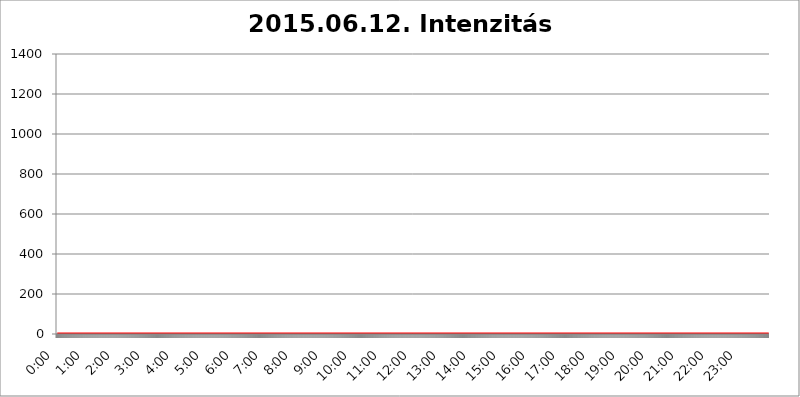
| Category | 2015.06.12. Intenzitás [W/m^2] |
|---|---|
| 0.0 | 0 |
| 0.0006944444444444445 | 0 |
| 0.001388888888888889 | 0 |
| 0.0020833333333333333 | 0 |
| 0.002777777777777778 | 0 |
| 0.003472222222222222 | 0 |
| 0.004166666666666667 | 0 |
| 0.004861111111111111 | 0 |
| 0.005555555555555556 | 0 |
| 0.0062499999999999995 | 0 |
| 0.006944444444444444 | 0 |
| 0.007638888888888889 | 0 |
| 0.008333333333333333 | 0 |
| 0.009027777777777779 | 0 |
| 0.009722222222222222 | 0 |
| 0.010416666666666666 | 0 |
| 0.011111111111111112 | 0 |
| 0.011805555555555555 | 0 |
| 0.012499999999999999 | 0 |
| 0.013194444444444444 | 0 |
| 0.013888888888888888 | 0 |
| 0.014583333333333332 | 0 |
| 0.015277777777777777 | 0 |
| 0.015972222222222224 | 0 |
| 0.016666666666666666 | 0 |
| 0.017361111111111112 | 0 |
| 0.018055555555555557 | 0 |
| 0.01875 | 0 |
| 0.019444444444444445 | 0 |
| 0.02013888888888889 | 0 |
| 0.020833333333333332 | 0 |
| 0.02152777777777778 | 0 |
| 0.022222222222222223 | 0 |
| 0.02291666666666667 | 0 |
| 0.02361111111111111 | 0 |
| 0.024305555555555556 | 0 |
| 0.024999999999999998 | 0 |
| 0.025694444444444447 | 0 |
| 0.02638888888888889 | 0 |
| 0.027083333333333334 | 0 |
| 0.027777777777777776 | 0 |
| 0.02847222222222222 | 0 |
| 0.029166666666666664 | 0 |
| 0.029861111111111113 | 0 |
| 0.030555555555555555 | 0 |
| 0.03125 | 0 |
| 0.03194444444444445 | 0 |
| 0.03263888888888889 | 0 |
| 0.03333333333333333 | 0 |
| 0.034027777777777775 | 0 |
| 0.034722222222222224 | 0 |
| 0.035416666666666666 | 0 |
| 0.036111111111111115 | 0 |
| 0.03680555555555556 | 0 |
| 0.0375 | 0 |
| 0.03819444444444444 | 0 |
| 0.03888888888888889 | 0 |
| 0.03958333333333333 | 0 |
| 0.04027777777777778 | 0 |
| 0.04097222222222222 | 0 |
| 0.041666666666666664 | 0 |
| 0.042361111111111106 | 0 |
| 0.04305555555555556 | 0 |
| 0.043750000000000004 | 0 |
| 0.044444444444444446 | 0 |
| 0.04513888888888889 | 0 |
| 0.04583333333333334 | 0 |
| 0.04652777777777778 | 0 |
| 0.04722222222222222 | 0 |
| 0.04791666666666666 | 0 |
| 0.04861111111111111 | 0 |
| 0.049305555555555554 | 0 |
| 0.049999999999999996 | 0 |
| 0.05069444444444445 | 0 |
| 0.051388888888888894 | 0 |
| 0.052083333333333336 | 0 |
| 0.05277777777777778 | 0 |
| 0.05347222222222222 | 0 |
| 0.05416666666666667 | 0 |
| 0.05486111111111111 | 0 |
| 0.05555555555555555 | 0 |
| 0.05625 | 0 |
| 0.05694444444444444 | 0 |
| 0.057638888888888885 | 0 |
| 0.05833333333333333 | 0 |
| 0.05902777777777778 | 0 |
| 0.059722222222222225 | 0 |
| 0.06041666666666667 | 0 |
| 0.061111111111111116 | 0 |
| 0.06180555555555556 | 0 |
| 0.0625 | 0 |
| 0.06319444444444444 | 0 |
| 0.06388888888888888 | 0 |
| 0.06458333333333334 | 0 |
| 0.06527777777777778 | 0 |
| 0.06597222222222222 | 0 |
| 0.06666666666666667 | 0 |
| 0.06736111111111111 | 0 |
| 0.06805555555555555 | 0 |
| 0.06874999999999999 | 0 |
| 0.06944444444444443 | 0 |
| 0.07013888888888889 | 0 |
| 0.07083333333333333 | 0 |
| 0.07152777777777779 | 0 |
| 0.07222222222222223 | 0 |
| 0.07291666666666667 | 0 |
| 0.07361111111111111 | 0 |
| 0.07430555555555556 | 0 |
| 0.075 | 0 |
| 0.07569444444444444 | 0 |
| 0.0763888888888889 | 0 |
| 0.07708333333333334 | 0 |
| 0.07777777777777778 | 0 |
| 0.07847222222222222 | 0 |
| 0.07916666666666666 | 0 |
| 0.0798611111111111 | 0 |
| 0.08055555555555556 | 0 |
| 0.08125 | 0 |
| 0.08194444444444444 | 0 |
| 0.08263888888888889 | 0 |
| 0.08333333333333333 | 0 |
| 0.08402777777777777 | 0 |
| 0.08472222222222221 | 0 |
| 0.08541666666666665 | 0 |
| 0.08611111111111112 | 0 |
| 0.08680555555555557 | 0 |
| 0.08750000000000001 | 0 |
| 0.08819444444444445 | 0 |
| 0.08888888888888889 | 0 |
| 0.08958333333333333 | 0 |
| 0.09027777777777778 | 0 |
| 0.09097222222222222 | 0 |
| 0.09166666666666667 | 0 |
| 0.09236111111111112 | 0 |
| 0.09305555555555556 | 0 |
| 0.09375 | 0 |
| 0.09444444444444444 | 0 |
| 0.09513888888888888 | 0 |
| 0.09583333333333333 | 0 |
| 0.09652777777777777 | 0 |
| 0.09722222222222222 | 0 |
| 0.09791666666666667 | 0 |
| 0.09861111111111111 | 0 |
| 0.09930555555555555 | 0 |
| 0.09999999999999999 | 0 |
| 0.10069444444444443 | 0 |
| 0.1013888888888889 | 0 |
| 0.10208333333333335 | 0 |
| 0.10277777777777779 | 0 |
| 0.10347222222222223 | 0 |
| 0.10416666666666667 | 0 |
| 0.10486111111111111 | 0 |
| 0.10555555555555556 | 0 |
| 0.10625 | 0 |
| 0.10694444444444444 | 0 |
| 0.1076388888888889 | 0 |
| 0.10833333333333334 | 0 |
| 0.10902777777777778 | 0 |
| 0.10972222222222222 | 0 |
| 0.1111111111111111 | 0 |
| 0.11180555555555556 | 0 |
| 0.11180555555555556 | 0 |
| 0.1125 | 0 |
| 0.11319444444444444 | 0 |
| 0.11388888888888889 | 0 |
| 0.11458333333333333 | 0 |
| 0.11527777777777777 | 0 |
| 0.11597222222222221 | 0 |
| 0.11666666666666665 | 0 |
| 0.1173611111111111 | 0 |
| 0.11805555555555557 | 0 |
| 0.11944444444444445 | 0 |
| 0.12013888888888889 | 0 |
| 0.12083333333333333 | 0 |
| 0.12152777777777778 | 0 |
| 0.12222222222222223 | 0 |
| 0.12291666666666667 | 0 |
| 0.12291666666666667 | 0 |
| 0.12361111111111112 | 0 |
| 0.12430555555555556 | 0 |
| 0.125 | 0 |
| 0.12569444444444444 | 0 |
| 0.12638888888888888 | 0 |
| 0.12708333333333333 | 0 |
| 0.16875 | 0 |
| 0.12847222222222224 | 0 |
| 0.12916666666666668 | 0 |
| 0.12986111111111112 | 0 |
| 0.13055555555555556 | 0 |
| 0.13125 | 0 |
| 0.13194444444444445 | 0 |
| 0.1326388888888889 | 0 |
| 0.13333333333333333 | 0 |
| 0.13402777777777777 | 0 |
| 0.13402777777777777 | 0 |
| 0.13472222222222222 | 0 |
| 0.13541666666666666 | 0 |
| 0.1361111111111111 | 0 |
| 0.13749999999999998 | 0 |
| 0.13819444444444443 | 0 |
| 0.1388888888888889 | 0 |
| 0.13958333333333334 | 0 |
| 0.14027777777777778 | 0 |
| 0.14097222222222222 | 0 |
| 0.14166666666666666 | 0 |
| 0.1423611111111111 | 0 |
| 0.14305555555555557 | 0 |
| 0.14375000000000002 | 0 |
| 0.14444444444444446 | 0 |
| 0.1451388888888889 | 0 |
| 0.1451388888888889 | 0 |
| 0.14652777777777778 | 0 |
| 0.14722222222222223 | 0 |
| 0.14791666666666667 | 0 |
| 0.1486111111111111 | 0 |
| 0.14930555555555555 | 0 |
| 0.15 | 0 |
| 0.15069444444444444 | 0 |
| 0.15138888888888888 | 0 |
| 0.15208333333333332 | 0 |
| 0.15277777777777776 | 0 |
| 0.15347222222222223 | 0 |
| 0.15416666666666667 | 0 |
| 0.15486111111111112 | 0 |
| 0.15555555555555556 | 0 |
| 0.15625 | 0 |
| 0.15694444444444444 | 0 |
| 0.15763888888888888 | 0 |
| 0.15833333333333333 | 0 |
| 0.15902777777777777 | 0 |
| 0.15972222222222224 | 0 |
| 0.16041666666666668 | 0 |
| 0.16111111111111112 | 0 |
| 0.16180555555555556 | 0 |
| 0.1625 | 0 |
| 0.16319444444444445 | 0 |
| 0.1638888888888889 | 0 |
| 0.16458333333333333 | 0 |
| 0.16527777777777777 | 0 |
| 0.16597222222222222 | 0 |
| 0.16666666666666666 | 0 |
| 0.1673611111111111 | 0 |
| 0.16805555555555554 | 0 |
| 0.16874999999999998 | 0 |
| 0.16944444444444443 | 0 |
| 0.17013888888888887 | 0 |
| 0.1708333333333333 | 0 |
| 0.17152777777777775 | 0 |
| 0.17222222222222225 | 0 |
| 0.1729166666666667 | 0 |
| 0.17361111111111113 | 0 |
| 0.17430555555555557 | 0 |
| 0.17500000000000002 | 0 |
| 0.17569444444444446 | 0 |
| 0.1763888888888889 | 0 |
| 0.17708333333333334 | 0 |
| 0.17777777777777778 | 0 |
| 0.17847222222222223 | 0 |
| 0.17916666666666667 | 0 |
| 0.1798611111111111 | 0 |
| 0.18055555555555555 | 0 |
| 0.18125 | 0 |
| 0.18194444444444444 | 0 |
| 0.1826388888888889 | 0 |
| 0.18333333333333335 | 0 |
| 0.1840277777777778 | 0 |
| 0.18472222222222223 | 0 |
| 0.18541666666666667 | 0 |
| 0.18611111111111112 | 0 |
| 0.18680555555555556 | 0 |
| 0.1875 | 0 |
| 0.18819444444444444 | 0 |
| 0.18888888888888888 | 0 |
| 0.18958333333333333 | 0 |
| 0.19027777777777777 | 0 |
| 0.1909722222222222 | 0 |
| 0.19166666666666665 | 0 |
| 0.19236111111111112 | 0 |
| 0.19305555555555554 | 0 |
| 0.19375 | 0 |
| 0.19444444444444445 | 0 |
| 0.1951388888888889 | 0 |
| 0.19583333333333333 | 0 |
| 0.19652777777777777 | 0 |
| 0.19722222222222222 | 0 |
| 0.19791666666666666 | 0 |
| 0.1986111111111111 | 0 |
| 0.19930555555555554 | 0 |
| 0.19999999999999998 | 0 |
| 0.20069444444444443 | 0 |
| 0.20138888888888887 | 0 |
| 0.2020833333333333 | 0 |
| 0.2027777777777778 | 0 |
| 0.2034722222222222 | 0 |
| 0.2041666666666667 | 0 |
| 0.20486111111111113 | 0 |
| 0.20555555555555557 | 0 |
| 0.20625000000000002 | 0 |
| 0.20694444444444446 | 0 |
| 0.2076388888888889 | 0 |
| 0.20833333333333334 | 0 |
| 0.20902777777777778 | 0 |
| 0.20972222222222223 | 0 |
| 0.21041666666666667 | 0 |
| 0.2111111111111111 | 0 |
| 0.21180555555555555 | 0 |
| 0.2125 | 0 |
| 0.21319444444444444 | 0 |
| 0.2138888888888889 | 0 |
| 0.21458333333333335 | 0 |
| 0.2152777777777778 | 0 |
| 0.21597222222222223 | 0 |
| 0.21666666666666667 | 0 |
| 0.21736111111111112 | 0 |
| 0.21805555555555556 | 0 |
| 0.21875 | 0 |
| 0.21944444444444444 | 0 |
| 0.22013888888888888 | 0 |
| 0.22083333333333333 | 0 |
| 0.22152777777777777 | 0 |
| 0.2222222222222222 | 0 |
| 0.22291666666666665 | 0 |
| 0.2236111111111111 | 0 |
| 0.22430555555555556 | 0 |
| 0.225 | 0 |
| 0.22569444444444445 | 0 |
| 0.2263888888888889 | 0 |
| 0.22708333333333333 | 0 |
| 0.22777777777777777 | 0 |
| 0.22847222222222222 | 0 |
| 0.22916666666666666 | 0 |
| 0.2298611111111111 | 0 |
| 0.23055555555555554 | 0 |
| 0.23124999999999998 | 0 |
| 0.23194444444444443 | 0 |
| 0.23263888888888887 | 0 |
| 0.2333333333333333 | 0 |
| 0.2340277777777778 | 0 |
| 0.2347222222222222 | 0 |
| 0.2354166666666667 | 0 |
| 0.23611111111111113 | 0 |
| 0.23680555555555557 | 0 |
| 0.23750000000000002 | 0 |
| 0.23819444444444446 | 0 |
| 0.2388888888888889 | 0 |
| 0.23958333333333334 | 0 |
| 0.24027777777777778 | 0 |
| 0.24097222222222223 | 0 |
| 0.24166666666666667 | 0 |
| 0.2423611111111111 | 0 |
| 0.24305555555555555 | 0 |
| 0.24375 | 0 |
| 0.24444444444444446 | 0 |
| 0.24513888888888888 | 0 |
| 0.24583333333333335 | 0 |
| 0.2465277777777778 | 0 |
| 0.24722222222222223 | 0 |
| 0.24791666666666667 | 0 |
| 0.24861111111111112 | 0 |
| 0.24930555555555556 | 0 |
| 0.25 | 0 |
| 0.25069444444444444 | 0 |
| 0.2513888888888889 | 0 |
| 0.2520833333333333 | 0 |
| 0.25277777777777777 | 0 |
| 0.2534722222222222 | 0 |
| 0.25416666666666665 | 0 |
| 0.2548611111111111 | 0 |
| 0.2555555555555556 | 0 |
| 0.25625000000000003 | 0 |
| 0.2569444444444445 | 0 |
| 0.2576388888888889 | 0 |
| 0.25833333333333336 | 0 |
| 0.2590277777777778 | 0 |
| 0.25972222222222224 | 0 |
| 0.2604166666666667 | 0 |
| 0.2611111111111111 | 0 |
| 0.26180555555555557 | 0 |
| 0.2625 | 0 |
| 0.26319444444444445 | 0 |
| 0.2638888888888889 | 0 |
| 0.26458333333333334 | 0 |
| 0.2652777777777778 | 0 |
| 0.2659722222222222 | 0 |
| 0.26666666666666666 | 0 |
| 0.2673611111111111 | 0 |
| 0.26805555555555555 | 0 |
| 0.26875 | 0 |
| 0.26944444444444443 | 0 |
| 0.2701388888888889 | 0 |
| 0.2708333333333333 | 0 |
| 0.27152777777777776 | 0 |
| 0.2722222222222222 | 0 |
| 0.27291666666666664 | 0 |
| 0.2736111111111111 | 0 |
| 0.2743055555555555 | 0 |
| 0.27499999999999997 | 0 |
| 0.27569444444444446 | 0 |
| 0.27638888888888885 | 0 |
| 0.27708333333333335 | 0 |
| 0.2777777777777778 | 0 |
| 0.27847222222222223 | 0 |
| 0.2791666666666667 | 0 |
| 0.2798611111111111 | 0 |
| 0.28055555555555556 | 0 |
| 0.28125 | 0 |
| 0.28194444444444444 | 0 |
| 0.2826388888888889 | 0 |
| 0.2833333333333333 | 0 |
| 0.28402777777777777 | 0 |
| 0.2847222222222222 | 0 |
| 0.28541666666666665 | 0 |
| 0.28611111111111115 | 0 |
| 0.28680555555555554 | 0 |
| 0.28750000000000003 | 0 |
| 0.2881944444444445 | 0 |
| 0.2888888888888889 | 0 |
| 0.28958333333333336 | 0 |
| 0.2902777777777778 | 0 |
| 0.29097222222222224 | 0 |
| 0.2916666666666667 | 0 |
| 0.2923611111111111 | 0 |
| 0.29305555555555557 | 0 |
| 0.29375 | 0 |
| 0.29444444444444445 | 0 |
| 0.2951388888888889 | 0 |
| 0.29583333333333334 | 0 |
| 0.2965277777777778 | 0 |
| 0.2972222222222222 | 0 |
| 0.29791666666666666 | 0 |
| 0.2986111111111111 | 0 |
| 0.29930555555555555 | 0 |
| 0.3 | 0 |
| 0.30069444444444443 | 0 |
| 0.3013888888888889 | 0 |
| 0.3020833333333333 | 0 |
| 0.30277777777777776 | 0 |
| 0.3034722222222222 | 0 |
| 0.30416666666666664 | 0 |
| 0.3048611111111111 | 0 |
| 0.3055555555555555 | 0 |
| 0.30624999999999997 | 0 |
| 0.3069444444444444 | 0 |
| 0.3076388888888889 | 0 |
| 0.30833333333333335 | 0 |
| 0.3090277777777778 | 0 |
| 0.30972222222222223 | 0 |
| 0.3104166666666667 | 0 |
| 0.3111111111111111 | 0 |
| 0.31180555555555556 | 0 |
| 0.3125 | 0 |
| 0.31319444444444444 | 0 |
| 0.3138888888888889 | 0 |
| 0.3145833333333333 | 0 |
| 0.31527777777777777 | 0 |
| 0.3159722222222222 | 0 |
| 0.31666666666666665 | 0 |
| 0.31736111111111115 | 0 |
| 0.31805555555555554 | 0 |
| 0.31875000000000003 | 0 |
| 0.3194444444444445 | 0 |
| 0.3201388888888889 | 0 |
| 0.32083333333333336 | 0 |
| 0.3215277777777778 | 0 |
| 0.32222222222222224 | 0 |
| 0.3229166666666667 | 0 |
| 0.3236111111111111 | 0 |
| 0.32430555555555557 | 0 |
| 0.325 | 0 |
| 0.32569444444444445 | 0 |
| 0.3263888888888889 | 0 |
| 0.32708333333333334 | 0 |
| 0.3277777777777778 | 0 |
| 0.3284722222222222 | 0 |
| 0.32916666666666666 | 0 |
| 0.3298611111111111 | 0 |
| 0.33055555555555555 | 0 |
| 0.33125 | 0 |
| 0.33194444444444443 | 0 |
| 0.3326388888888889 | 0 |
| 0.3333333333333333 | 0 |
| 0.3340277777777778 | 0 |
| 0.3347222222222222 | 0 |
| 0.3354166666666667 | 0 |
| 0.3361111111111111 | 0 |
| 0.3368055555555556 | 0 |
| 0.33749999999999997 | 0 |
| 0.33819444444444446 | 0 |
| 0.33888888888888885 | 0 |
| 0.33958333333333335 | 0 |
| 0.34027777777777773 | 0 |
| 0.34097222222222223 | 0 |
| 0.3416666666666666 | 0 |
| 0.3423611111111111 | 0 |
| 0.3430555555555555 | 0 |
| 0.34375 | 0 |
| 0.3444444444444445 | 0 |
| 0.3451388888888889 | 0 |
| 0.3458333333333334 | 0 |
| 0.34652777777777777 | 0 |
| 0.34722222222222227 | 0 |
| 0.34791666666666665 | 0 |
| 0.34861111111111115 | 0 |
| 0.34930555555555554 | 0 |
| 0.35000000000000003 | 0 |
| 0.3506944444444444 | 0 |
| 0.3513888888888889 | 0 |
| 0.3520833333333333 | 0 |
| 0.3527777777777778 | 0 |
| 0.3534722222222222 | 0 |
| 0.3541666666666667 | 0 |
| 0.3548611111111111 | 0 |
| 0.35555555555555557 | 0 |
| 0.35625 | 0 |
| 0.35694444444444445 | 0 |
| 0.3576388888888889 | 0 |
| 0.35833333333333334 | 0 |
| 0.3590277777777778 | 0 |
| 0.3597222222222222 | 0 |
| 0.36041666666666666 | 0 |
| 0.3611111111111111 | 0 |
| 0.36180555555555555 | 0 |
| 0.3625 | 0 |
| 0.36319444444444443 | 0 |
| 0.3638888888888889 | 0 |
| 0.3645833333333333 | 0 |
| 0.3652777777777778 | 0 |
| 0.3659722222222222 | 0 |
| 0.3666666666666667 | 0 |
| 0.3673611111111111 | 0 |
| 0.3680555555555556 | 0 |
| 0.36874999999999997 | 0 |
| 0.36944444444444446 | 0 |
| 0.37013888888888885 | 0 |
| 0.37083333333333335 | 0 |
| 0.37152777777777773 | 0 |
| 0.37222222222222223 | 0 |
| 0.3729166666666666 | 0 |
| 0.3736111111111111 | 0 |
| 0.3743055555555555 | 0 |
| 0.375 | 0 |
| 0.3756944444444445 | 0 |
| 0.3763888888888889 | 0 |
| 0.3770833333333334 | 0 |
| 0.37777777777777777 | 0 |
| 0.37847222222222227 | 0 |
| 0.37916666666666665 | 0 |
| 0.37986111111111115 | 0 |
| 0.38055555555555554 | 0 |
| 0.38125000000000003 | 0 |
| 0.3819444444444444 | 0 |
| 0.3826388888888889 | 0 |
| 0.3833333333333333 | 0 |
| 0.3840277777777778 | 0 |
| 0.3847222222222222 | 0 |
| 0.3854166666666667 | 0 |
| 0.3861111111111111 | 0 |
| 0.38680555555555557 | 0 |
| 0.3875 | 0 |
| 0.38819444444444445 | 0 |
| 0.3888888888888889 | 0 |
| 0.38958333333333334 | 0 |
| 0.3902777777777778 | 0 |
| 0.3909722222222222 | 0 |
| 0.39166666666666666 | 0 |
| 0.3923611111111111 | 0 |
| 0.39305555555555555 | 0 |
| 0.39375 | 0 |
| 0.39444444444444443 | 0 |
| 0.3951388888888889 | 0 |
| 0.3958333333333333 | 0 |
| 0.3965277777777778 | 0 |
| 0.3972222222222222 | 0 |
| 0.3979166666666667 | 0 |
| 0.3986111111111111 | 0 |
| 0.3993055555555556 | 0 |
| 0.39999999999999997 | 0 |
| 0.40069444444444446 | 0 |
| 0.40138888888888885 | 0 |
| 0.40208333333333335 | 0 |
| 0.40277777777777773 | 0 |
| 0.40347222222222223 | 0 |
| 0.4041666666666666 | 0 |
| 0.4048611111111111 | 0 |
| 0.4055555555555555 | 0 |
| 0.40625 | 0 |
| 0.4069444444444445 | 0 |
| 0.4076388888888889 | 0 |
| 0.4083333333333334 | 0 |
| 0.40902777777777777 | 0 |
| 0.40972222222222227 | 0 |
| 0.41041666666666665 | 0 |
| 0.41111111111111115 | 0 |
| 0.41180555555555554 | 0 |
| 0.41250000000000003 | 0 |
| 0.4131944444444444 | 0 |
| 0.4138888888888889 | 0 |
| 0.4145833333333333 | 0 |
| 0.4152777777777778 | 0 |
| 0.4159722222222222 | 0 |
| 0.4166666666666667 | 0 |
| 0.4173611111111111 | 0 |
| 0.41805555555555557 | 0 |
| 0.41875 | 0 |
| 0.41944444444444445 | 0 |
| 0.4201388888888889 | 0 |
| 0.42083333333333334 | 0 |
| 0.4215277777777778 | 0 |
| 0.4222222222222222 | 0 |
| 0.42291666666666666 | 0 |
| 0.4236111111111111 | 0 |
| 0.42430555555555555 | 0 |
| 0.425 | 0 |
| 0.42569444444444443 | 0 |
| 0.4263888888888889 | 0 |
| 0.4270833333333333 | 0 |
| 0.4277777777777778 | 0 |
| 0.4284722222222222 | 0 |
| 0.4291666666666667 | 0 |
| 0.4298611111111111 | 0 |
| 0.4305555555555556 | 0 |
| 0.43124999999999997 | 0 |
| 0.43194444444444446 | 0 |
| 0.43263888888888885 | 0 |
| 0.43333333333333335 | 0 |
| 0.43402777777777773 | 0 |
| 0.43472222222222223 | 0 |
| 0.4354166666666666 | 0 |
| 0.4361111111111111 | 0 |
| 0.4368055555555555 | 0 |
| 0.4375 | 0 |
| 0.4381944444444445 | 0 |
| 0.4388888888888889 | 0 |
| 0.4395833333333334 | 0 |
| 0.44027777777777777 | 0 |
| 0.44097222222222227 | 0 |
| 0.44166666666666665 | 0 |
| 0.44236111111111115 | 0 |
| 0.44305555555555554 | 0 |
| 0.44375000000000003 | 0 |
| 0.4444444444444444 | 0 |
| 0.4451388888888889 | 0 |
| 0.4458333333333333 | 0 |
| 0.4465277777777778 | 0 |
| 0.4472222222222222 | 0 |
| 0.4479166666666667 | 0 |
| 0.4486111111111111 | 0 |
| 0.44930555555555557 | 0 |
| 0.45 | 0 |
| 0.45069444444444445 | 0 |
| 0.4513888888888889 | 0 |
| 0.45208333333333334 | 0 |
| 0.4527777777777778 | 0 |
| 0.4534722222222222 | 0 |
| 0.45416666666666666 | 0 |
| 0.4548611111111111 | 0 |
| 0.45555555555555555 | 0 |
| 0.45625 | 0 |
| 0.45694444444444443 | 0 |
| 0.4576388888888889 | 0 |
| 0.4583333333333333 | 0 |
| 0.4590277777777778 | 0 |
| 0.4597222222222222 | 0 |
| 0.4604166666666667 | 0 |
| 0.4611111111111111 | 0 |
| 0.4618055555555556 | 0 |
| 0.46249999999999997 | 0 |
| 0.46319444444444446 | 0 |
| 0.46388888888888885 | 0 |
| 0.46458333333333335 | 0 |
| 0.46527777777777773 | 0 |
| 0.46597222222222223 | 0 |
| 0.4666666666666666 | 0 |
| 0.4673611111111111 | 0 |
| 0.4680555555555555 | 0 |
| 0.46875 | 0 |
| 0.4694444444444445 | 0 |
| 0.4701388888888889 | 0 |
| 0.4708333333333334 | 0 |
| 0.47152777777777777 | 0 |
| 0.47222222222222227 | 0 |
| 0.47291666666666665 | 0 |
| 0.47361111111111115 | 0 |
| 0.47430555555555554 | 0 |
| 0.47500000000000003 | 0 |
| 0.4756944444444444 | 0 |
| 0.4763888888888889 | 0 |
| 0.4770833333333333 | 0 |
| 0.4777777777777778 | 0 |
| 0.4784722222222222 | 0 |
| 0.4791666666666667 | 0 |
| 0.4798611111111111 | 0 |
| 0.48055555555555557 | 0 |
| 0.48125 | 0 |
| 0.48194444444444445 | 0 |
| 0.4826388888888889 | 0 |
| 0.48333333333333334 | 0 |
| 0.4840277777777778 | 0 |
| 0.4847222222222222 | 0 |
| 0.48541666666666666 | 0 |
| 0.4861111111111111 | 0 |
| 0.48680555555555555 | 0 |
| 0.4875 | 0 |
| 0.48819444444444443 | 0 |
| 0.4888888888888889 | 0 |
| 0.4895833333333333 | 0 |
| 0.4902777777777778 | 0 |
| 0.4909722222222222 | 0 |
| 0.4916666666666667 | 0 |
| 0.4923611111111111 | 0 |
| 0.4930555555555556 | 0 |
| 0.49374999999999997 | 0 |
| 0.49444444444444446 | 0 |
| 0.49513888888888885 | 0 |
| 0.49583333333333335 | 0 |
| 0.49652777777777773 | 0 |
| 0.49722222222222223 | 0 |
| 0.4979166666666666 | 0 |
| 0.4986111111111111 | 0 |
| 0.4993055555555555 | 0 |
| 0.5 | 0 |
| 0.5006944444444444 | 0 |
| 0.5013888888888889 | 0 |
| 0.5020833333333333 | 0 |
| 0.5027777777777778 | 0 |
| 0.5034722222222222 | 0 |
| 0.5041666666666667 | 0 |
| 0.5048611111111111 | 0 |
| 0.5055555555555555 | 0 |
| 0.50625 | 0 |
| 0.5069444444444444 | 0 |
| 0.5076388888888889 | 0 |
| 0.5083333333333333 | 0 |
| 0.5090277777777777 | 0 |
| 0.5097222222222222 | 0 |
| 0.5104166666666666 | 0 |
| 0.5111111111111112 | 0 |
| 0.5118055555555555 | 0 |
| 0.5125000000000001 | 0 |
| 0.5131944444444444 | 0 |
| 0.513888888888889 | 0 |
| 0.5145833333333333 | 0 |
| 0.5152777777777778 | 0 |
| 0.5159722222222222 | 0 |
| 0.5166666666666667 | 0 |
| 0.517361111111111 | 0 |
| 0.5180555555555556 | 0 |
| 0.5187499999999999 | 0 |
| 0.5194444444444445 | 0 |
| 0.5201388888888888 | 0 |
| 0.5208333333333334 | 0 |
| 0.5215277777777778 | 0 |
| 0.5222222222222223 | 0 |
| 0.5229166666666667 | 0 |
| 0.5236111111111111 | 0 |
| 0.5243055555555556 | 0 |
| 0.525 | 0 |
| 0.5256944444444445 | 0 |
| 0.5263888888888889 | 0 |
| 0.5270833333333333 | 0 |
| 0.5277777777777778 | 0 |
| 0.5284722222222222 | 0 |
| 0.5291666666666667 | 0 |
| 0.5298611111111111 | 0 |
| 0.5305555555555556 | 0 |
| 0.53125 | 0 |
| 0.5319444444444444 | 0 |
| 0.5326388888888889 | 0 |
| 0.5333333333333333 | 0 |
| 0.5340277777777778 | 0 |
| 0.5347222222222222 | 0 |
| 0.5354166666666667 | 0 |
| 0.5361111111111111 | 0 |
| 0.5368055555555555 | 0 |
| 0.5375 | 0 |
| 0.5381944444444444 | 0 |
| 0.5388888888888889 | 0 |
| 0.5395833333333333 | 0 |
| 0.5402777777777777 | 0 |
| 0.5409722222222222 | 0 |
| 0.5416666666666666 | 0 |
| 0.5423611111111112 | 0 |
| 0.5430555555555555 | 0 |
| 0.5437500000000001 | 0 |
| 0.5444444444444444 | 0 |
| 0.545138888888889 | 0 |
| 0.5458333333333333 | 0 |
| 0.5465277777777778 | 0 |
| 0.5472222222222222 | 0 |
| 0.5479166666666667 | 0 |
| 0.548611111111111 | 0 |
| 0.5493055555555556 | 0 |
| 0.5499999999999999 | 0 |
| 0.5506944444444445 | 0 |
| 0.5513888888888888 | 0 |
| 0.5520833333333334 | 0 |
| 0.5527777777777778 | 0 |
| 0.5534722222222223 | 0 |
| 0.5541666666666667 | 0 |
| 0.5548611111111111 | 0 |
| 0.5555555555555556 | 0 |
| 0.55625 | 0 |
| 0.5569444444444445 | 0 |
| 0.5576388888888889 | 0 |
| 0.5583333333333333 | 0 |
| 0.5590277777777778 | 0 |
| 0.5597222222222222 | 0 |
| 0.5604166666666667 | 0 |
| 0.5611111111111111 | 0 |
| 0.5618055555555556 | 0 |
| 0.5625 | 0 |
| 0.5631944444444444 | 0 |
| 0.5638888888888889 | 0 |
| 0.5645833333333333 | 0 |
| 0.5652777777777778 | 0 |
| 0.5659722222222222 | 0 |
| 0.5666666666666667 | 0 |
| 0.5673611111111111 | 0 |
| 0.5680555555555555 | 0 |
| 0.56875 | 0 |
| 0.5694444444444444 | 0 |
| 0.5701388888888889 | 0 |
| 0.5708333333333333 | 0 |
| 0.5715277777777777 | 0 |
| 0.5722222222222222 | 0 |
| 0.5729166666666666 | 0 |
| 0.5736111111111112 | 0 |
| 0.5743055555555555 | 0 |
| 0.5750000000000001 | 0 |
| 0.5756944444444444 | 0 |
| 0.576388888888889 | 0 |
| 0.5770833333333333 | 0 |
| 0.5777777777777778 | 0 |
| 0.5784722222222222 | 0 |
| 0.5791666666666667 | 0 |
| 0.579861111111111 | 0 |
| 0.5805555555555556 | 0 |
| 0.5812499999999999 | 0 |
| 0.5819444444444445 | 0 |
| 0.5826388888888888 | 0 |
| 0.5833333333333334 | 0 |
| 0.5840277777777778 | 0 |
| 0.5847222222222223 | 0 |
| 0.5854166666666667 | 0 |
| 0.5861111111111111 | 0 |
| 0.5868055555555556 | 0 |
| 0.5875 | 0 |
| 0.5881944444444445 | 0 |
| 0.5888888888888889 | 0 |
| 0.5895833333333333 | 0 |
| 0.5902777777777778 | 0 |
| 0.5909722222222222 | 0 |
| 0.5916666666666667 | 0 |
| 0.5923611111111111 | 0 |
| 0.5930555555555556 | 0 |
| 0.59375 | 0 |
| 0.5944444444444444 | 0 |
| 0.5951388888888889 | 0 |
| 0.5958333333333333 | 0 |
| 0.5965277777777778 | 0 |
| 0.5972222222222222 | 0 |
| 0.5979166666666667 | 0 |
| 0.5986111111111111 | 0 |
| 0.5993055555555555 | 0 |
| 0.6 | 0 |
| 0.6006944444444444 | 0 |
| 0.6013888888888889 | 0 |
| 0.6020833333333333 | 0 |
| 0.6027777777777777 | 0 |
| 0.6034722222222222 | 0 |
| 0.6041666666666666 | 0 |
| 0.6048611111111112 | 0 |
| 0.6055555555555555 | 0 |
| 0.6062500000000001 | 0 |
| 0.6069444444444444 | 0 |
| 0.607638888888889 | 0 |
| 0.6083333333333333 | 0 |
| 0.6090277777777778 | 0 |
| 0.6097222222222222 | 0 |
| 0.6104166666666667 | 0 |
| 0.611111111111111 | 0 |
| 0.6118055555555556 | 0 |
| 0.6124999999999999 | 0 |
| 0.6131944444444445 | 0 |
| 0.6138888888888888 | 0 |
| 0.6145833333333334 | 0 |
| 0.6152777777777778 | 0 |
| 0.6159722222222223 | 0 |
| 0.6166666666666667 | 0 |
| 0.6173611111111111 | 0 |
| 0.6180555555555556 | 0 |
| 0.61875 | 0 |
| 0.6194444444444445 | 0 |
| 0.6201388888888889 | 0 |
| 0.6208333333333333 | 0 |
| 0.6215277777777778 | 0 |
| 0.6222222222222222 | 0 |
| 0.6229166666666667 | 0 |
| 0.6236111111111111 | 0 |
| 0.6243055555555556 | 0 |
| 0.625 | 0 |
| 0.6256944444444444 | 0 |
| 0.6263888888888889 | 0 |
| 0.6270833333333333 | 0 |
| 0.6277777777777778 | 0 |
| 0.6284722222222222 | 0 |
| 0.6291666666666667 | 0 |
| 0.6298611111111111 | 0 |
| 0.6305555555555555 | 0 |
| 0.63125 | 0 |
| 0.6319444444444444 | 0 |
| 0.6326388888888889 | 0 |
| 0.6333333333333333 | 0 |
| 0.6340277777777777 | 0 |
| 0.6347222222222222 | 0 |
| 0.6354166666666666 | 0 |
| 0.6361111111111112 | 0 |
| 0.6368055555555555 | 0 |
| 0.6375000000000001 | 0 |
| 0.6381944444444444 | 0 |
| 0.638888888888889 | 0 |
| 0.6395833333333333 | 0 |
| 0.6402777777777778 | 0 |
| 0.6409722222222222 | 0 |
| 0.6416666666666667 | 0 |
| 0.642361111111111 | 0 |
| 0.6430555555555556 | 0 |
| 0.6437499999999999 | 0 |
| 0.6444444444444445 | 0 |
| 0.6451388888888888 | 0 |
| 0.6458333333333334 | 0 |
| 0.6465277777777778 | 0 |
| 0.6472222222222223 | 0 |
| 0.6479166666666667 | 0 |
| 0.6486111111111111 | 0 |
| 0.6493055555555556 | 0 |
| 0.65 | 0 |
| 0.6506944444444445 | 0 |
| 0.6513888888888889 | 0 |
| 0.6520833333333333 | 0 |
| 0.6527777777777778 | 0 |
| 0.6534722222222222 | 0 |
| 0.6541666666666667 | 0 |
| 0.6548611111111111 | 0 |
| 0.6555555555555556 | 0 |
| 0.65625 | 0 |
| 0.6569444444444444 | 0 |
| 0.6576388888888889 | 0 |
| 0.6583333333333333 | 0 |
| 0.6590277777777778 | 0 |
| 0.6597222222222222 | 0 |
| 0.6604166666666667 | 0 |
| 0.6611111111111111 | 0 |
| 0.6618055555555555 | 0 |
| 0.6625 | 0 |
| 0.6631944444444444 | 0 |
| 0.6638888888888889 | 0 |
| 0.6645833333333333 | 0 |
| 0.6652777777777777 | 0 |
| 0.6659722222222222 | 0 |
| 0.6666666666666666 | 0 |
| 0.6673611111111111 | 0 |
| 0.6680555555555556 | 0 |
| 0.6687500000000001 | 0 |
| 0.6694444444444444 | 0 |
| 0.6701388888888888 | 0 |
| 0.6708333333333334 | 0 |
| 0.6715277777777778 | 0 |
| 0.6722222222222222 | 0 |
| 0.6729166666666666 | 0 |
| 0.6736111111111112 | 0 |
| 0.6743055555555556 | 0 |
| 0.6749999999999999 | 0 |
| 0.6756944444444444 | 0 |
| 0.6763888888888889 | 0 |
| 0.6770833333333334 | 0 |
| 0.6777777777777777 | 0 |
| 0.6784722222222223 | 0 |
| 0.6791666666666667 | 0 |
| 0.6798611111111111 | 0 |
| 0.6805555555555555 | 0 |
| 0.68125 | 0 |
| 0.6819444444444445 | 0 |
| 0.6826388888888889 | 0 |
| 0.6833333333333332 | 0 |
| 0.6840277777777778 | 0 |
| 0.6847222222222222 | 0 |
| 0.6854166666666667 | 0 |
| 0.686111111111111 | 0 |
| 0.6868055555555556 | 0 |
| 0.6875 | 0 |
| 0.6881944444444444 | 0 |
| 0.688888888888889 | 0 |
| 0.6895833333333333 | 0 |
| 0.6902777777777778 | 0 |
| 0.6909722222222222 | 0 |
| 0.6916666666666668 | 0 |
| 0.6923611111111111 | 0 |
| 0.6930555555555555 | 0 |
| 0.69375 | 0 |
| 0.6944444444444445 | 0 |
| 0.6951388888888889 | 0 |
| 0.6958333333333333 | 0 |
| 0.6965277777777777 | 0 |
| 0.6972222222222223 | 0 |
| 0.6979166666666666 | 0 |
| 0.6986111111111111 | 0 |
| 0.6993055555555556 | 0 |
| 0.7000000000000001 | 0 |
| 0.7006944444444444 | 0 |
| 0.7013888888888888 | 0 |
| 0.7020833333333334 | 0 |
| 0.7027777777777778 | 0 |
| 0.7034722222222222 | 0 |
| 0.7041666666666666 | 0 |
| 0.7048611111111112 | 0 |
| 0.7055555555555556 | 0 |
| 0.7062499999999999 | 0 |
| 0.7069444444444444 | 0 |
| 0.7076388888888889 | 0 |
| 0.7083333333333334 | 0 |
| 0.7090277777777777 | 0 |
| 0.7097222222222223 | 0 |
| 0.7104166666666667 | 0 |
| 0.7111111111111111 | 0 |
| 0.7118055555555555 | 0 |
| 0.7125 | 0 |
| 0.7131944444444445 | 0 |
| 0.7138888888888889 | 0 |
| 0.7145833333333332 | 0 |
| 0.7152777777777778 | 0 |
| 0.7159722222222222 | 0 |
| 0.7166666666666667 | 0 |
| 0.717361111111111 | 0 |
| 0.7180555555555556 | 0 |
| 0.71875 | 0 |
| 0.7194444444444444 | 0 |
| 0.720138888888889 | 0 |
| 0.7208333333333333 | 0 |
| 0.7215277777777778 | 0 |
| 0.7222222222222222 | 0 |
| 0.7229166666666668 | 0 |
| 0.7236111111111111 | 0 |
| 0.7243055555555555 | 0 |
| 0.725 | 0 |
| 0.7256944444444445 | 0 |
| 0.7263888888888889 | 0 |
| 0.7270833333333333 | 0 |
| 0.7277777777777777 | 0 |
| 0.7284722222222223 | 0 |
| 0.7291666666666666 | 0 |
| 0.7298611111111111 | 0 |
| 0.7305555555555556 | 0 |
| 0.7312500000000001 | 0 |
| 0.7319444444444444 | 0 |
| 0.7326388888888888 | 0 |
| 0.7333333333333334 | 0 |
| 0.7340277777777778 | 0 |
| 0.7347222222222222 | 0 |
| 0.7354166666666666 | 0 |
| 0.7361111111111112 | 0 |
| 0.7368055555555556 | 0 |
| 0.7374999999999999 | 0 |
| 0.7381944444444444 | 0 |
| 0.7388888888888889 | 0 |
| 0.7395833333333334 | 0 |
| 0.7402777777777777 | 0 |
| 0.7409722222222223 | 0 |
| 0.7416666666666667 | 0 |
| 0.7423611111111111 | 0 |
| 0.7430555555555555 | 0 |
| 0.74375 | 0 |
| 0.7444444444444445 | 0 |
| 0.7451388888888889 | 0 |
| 0.7458333333333332 | 0 |
| 0.7465277777777778 | 0 |
| 0.7472222222222222 | 0 |
| 0.7479166666666667 | 0 |
| 0.748611111111111 | 0 |
| 0.7493055555555556 | 0 |
| 0.75 | 0 |
| 0.7506944444444444 | 0 |
| 0.751388888888889 | 0 |
| 0.7520833333333333 | 0 |
| 0.7527777777777778 | 0 |
| 0.7534722222222222 | 0 |
| 0.7541666666666668 | 0 |
| 0.7548611111111111 | 0 |
| 0.7555555555555555 | 0 |
| 0.75625 | 0 |
| 0.7569444444444445 | 0 |
| 0.7576388888888889 | 0 |
| 0.7583333333333333 | 0 |
| 0.7590277777777777 | 0 |
| 0.7597222222222223 | 0 |
| 0.7604166666666666 | 0 |
| 0.7611111111111111 | 0 |
| 0.7618055555555556 | 0 |
| 0.7625000000000001 | 0 |
| 0.7631944444444444 | 0 |
| 0.7638888888888888 | 0 |
| 0.7645833333333334 | 0 |
| 0.7652777777777778 | 0 |
| 0.7659722222222222 | 0 |
| 0.7666666666666666 | 0 |
| 0.7673611111111112 | 0 |
| 0.7680555555555556 | 0 |
| 0.7687499999999999 | 0 |
| 0.7694444444444444 | 0 |
| 0.7701388888888889 | 0 |
| 0.7708333333333334 | 0 |
| 0.7715277777777777 | 0 |
| 0.7722222222222223 | 0 |
| 0.7729166666666667 | 0 |
| 0.7736111111111111 | 0 |
| 0.7743055555555555 | 0 |
| 0.775 | 0 |
| 0.7756944444444445 | 0 |
| 0.7763888888888889 | 0 |
| 0.7770833333333332 | 0 |
| 0.7777777777777778 | 0 |
| 0.7784722222222222 | 0 |
| 0.7791666666666667 | 0 |
| 0.779861111111111 | 0 |
| 0.7805555555555556 | 0 |
| 0.78125 | 0 |
| 0.7819444444444444 | 0 |
| 0.782638888888889 | 0 |
| 0.7833333333333333 | 0 |
| 0.7840277777777778 | 0 |
| 0.7847222222222222 | 0 |
| 0.7854166666666668 | 0 |
| 0.7861111111111111 | 0 |
| 0.7868055555555555 | 0 |
| 0.7875 | 0 |
| 0.7881944444444445 | 0 |
| 0.7888888888888889 | 0 |
| 0.7895833333333333 | 0 |
| 0.7902777777777777 | 0 |
| 0.7909722222222223 | 0 |
| 0.7916666666666666 | 0 |
| 0.7923611111111111 | 0 |
| 0.7930555555555556 | 0 |
| 0.7937500000000001 | 0 |
| 0.7944444444444444 | 0 |
| 0.7951388888888888 | 0 |
| 0.7958333333333334 | 0 |
| 0.7965277777777778 | 0 |
| 0.7972222222222222 | 0 |
| 0.7979166666666666 | 0 |
| 0.7986111111111112 | 0 |
| 0.7993055555555556 | 0 |
| 0.7999999999999999 | 0 |
| 0.8006944444444444 | 0 |
| 0.8013888888888889 | 0 |
| 0.8020833333333334 | 0 |
| 0.8027777777777777 | 0 |
| 0.8034722222222223 | 0 |
| 0.8041666666666667 | 0 |
| 0.8048611111111111 | 0 |
| 0.8055555555555555 | 0 |
| 0.80625 | 0 |
| 0.8069444444444445 | 0 |
| 0.8076388888888889 | 0 |
| 0.8083333333333332 | 0 |
| 0.8090277777777778 | 0 |
| 0.8097222222222222 | 0 |
| 0.8104166666666667 | 0 |
| 0.811111111111111 | 0 |
| 0.8118055555555556 | 0 |
| 0.8125 | 0 |
| 0.8131944444444444 | 0 |
| 0.813888888888889 | 0 |
| 0.8145833333333333 | 0 |
| 0.8152777777777778 | 0 |
| 0.8159722222222222 | 0 |
| 0.8166666666666668 | 0 |
| 0.8173611111111111 | 0 |
| 0.8180555555555555 | 0 |
| 0.81875 | 0 |
| 0.8194444444444445 | 0 |
| 0.8201388888888889 | 0 |
| 0.8208333333333333 | 0 |
| 0.8215277777777777 | 0 |
| 0.8222222222222223 | 0 |
| 0.8229166666666666 | 0 |
| 0.8236111111111111 | 0 |
| 0.8243055555555556 | 0 |
| 0.8250000000000001 | 0 |
| 0.8256944444444444 | 0 |
| 0.8263888888888888 | 0 |
| 0.8270833333333334 | 0 |
| 0.8277777777777778 | 0 |
| 0.8284722222222222 | 0 |
| 0.8291666666666666 | 0 |
| 0.8298611111111112 | 0 |
| 0.8305555555555556 | 0 |
| 0.8312499999999999 | 0 |
| 0.8319444444444444 | 0 |
| 0.8326388888888889 | 0 |
| 0.8333333333333334 | 0 |
| 0.8340277777777777 | 0 |
| 0.8347222222222223 | 0 |
| 0.8354166666666667 | 0 |
| 0.8361111111111111 | 0 |
| 0.8368055555555555 | 0 |
| 0.8375 | 0 |
| 0.8381944444444445 | 0 |
| 0.8388888888888889 | 0 |
| 0.8395833333333332 | 0 |
| 0.8402777777777778 | 0 |
| 0.8409722222222222 | 0 |
| 0.8416666666666667 | 0 |
| 0.842361111111111 | 0 |
| 0.8430555555555556 | 0 |
| 0.84375 | 0 |
| 0.8444444444444444 | 0 |
| 0.845138888888889 | 0 |
| 0.8458333333333333 | 0 |
| 0.8465277777777778 | 0 |
| 0.8472222222222222 | 0 |
| 0.8479166666666668 | 0 |
| 0.8486111111111111 | 0 |
| 0.8493055555555555 | 0 |
| 0.85 | 0 |
| 0.8506944444444445 | 0 |
| 0.8513888888888889 | 0 |
| 0.8520833333333333 | 0 |
| 0.8527777777777777 | 0 |
| 0.8534722222222223 | 0 |
| 0.8541666666666666 | 0 |
| 0.8548611111111111 | 0 |
| 0.8555555555555556 | 0 |
| 0.8562500000000001 | 0 |
| 0.8569444444444444 | 0 |
| 0.8576388888888888 | 0 |
| 0.8583333333333334 | 0 |
| 0.8590277777777778 | 0 |
| 0.8597222222222222 | 0 |
| 0.8604166666666666 | 0 |
| 0.8611111111111112 | 0 |
| 0.8618055555555556 | 0 |
| 0.8624999999999999 | 0 |
| 0.8631944444444444 | 0 |
| 0.8638888888888889 | 0 |
| 0.8645833333333334 | 0 |
| 0.8652777777777777 | 0 |
| 0.8659722222222223 | 0 |
| 0.8666666666666667 | 0 |
| 0.8673611111111111 | 0 |
| 0.8680555555555555 | 0 |
| 0.86875 | 0 |
| 0.8694444444444445 | 0 |
| 0.8701388888888889 | 0 |
| 0.8708333333333332 | 0 |
| 0.8715277777777778 | 0 |
| 0.8722222222222222 | 0 |
| 0.8729166666666667 | 0 |
| 0.873611111111111 | 0 |
| 0.8743055555555556 | 0 |
| 0.875 | 0 |
| 0.8756944444444444 | 0 |
| 0.876388888888889 | 0 |
| 0.8770833333333333 | 0 |
| 0.8777777777777778 | 0 |
| 0.8784722222222222 | 0 |
| 0.8791666666666668 | 0 |
| 0.8798611111111111 | 0 |
| 0.8805555555555555 | 0 |
| 0.88125 | 0 |
| 0.8819444444444445 | 0 |
| 0.8826388888888889 | 0 |
| 0.8833333333333333 | 0 |
| 0.8840277777777777 | 0 |
| 0.8847222222222223 | 0 |
| 0.8854166666666666 | 0 |
| 0.8861111111111111 | 0 |
| 0.8868055555555556 | 0 |
| 0.8875000000000001 | 0 |
| 0.8881944444444444 | 0 |
| 0.8888888888888888 | 0 |
| 0.8895833333333334 | 0 |
| 0.8902777777777778 | 0 |
| 0.8909722222222222 | 0 |
| 0.8916666666666666 | 0 |
| 0.8923611111111112 | 0 |
| 0.8930555555555556 | 0 |
| 0.8937499999999999 | 0 |
| 0.8944444444444444 | 0 |
| 0.8951388888888889 | 0 |
| 0.8958333333333334 | 0 |
| 0.8965277777777777 | 0 |
| 0.8972222222222223 | 0 |
| 0.8979166666666667 | 0 |
| 0.8986111111111111 | 0 |
| 0.8993055555555555 | 0 |
| 0.9 | 0 |
| 0.9006944444444445 | 0 |
| 0.9013888888888889 | 0 |
| 0.9020833333333332 | 0 |
| 0.9027777777777778 | 0 |
| 0.9034722222222222 | 0 |
| 0.9041666666666667 | 0 |
| 0.904861111111111 | 0 |
| 0.9055555555555556 | 0 |
| 0.90625 | 0 |
| 0.9069444444444444 | 0 |
| 0.907638888888889 | 0 |
| 0.9083333333333333 | 0 |
| 0.9090277777777778 | 0 |
| 0.9097222222222222 | 0 |
| 0.9104166666666668 | 0 |
| 0.9111111111111111 | 0 |
| 0.9118055555555555 | 0 |
| 0.9125 | 0 |
| 0.9131944444444445 | 0 |
| 0.9138888888888889 | 0 |
| 0.9145833333333333 | 0 |
| 0.9152777777777777 | 0 |
| 0.9159722222222223 | 0 |
| 0.9166666666666666 | 0 |
| 0.9173611111111111 | 0 |
| 0.9180555555555556 | 0 |
| 0.9187500000000001 | 0 |
| 0.9194444444444444 | 0 |
| 0.9201388888888888 | 0 |
| 0.9208333333333334 | 0 |
| 0.9215277777777778 | 0 |
| 0.9222222222222222 | 0 |
| 0.9229166666666666 | 0 |
| 0.9236111111111112 | 0 |
| 0.9243055555555556 | 0 |
| 0.9249999999999999 | 0 |
| 0.9256944444444444 | 0 |
| 0.9263888888888889 | 0 |
| 0.9270833333333334 | 0 |
| 0.9277777777777777 | 0 |
| 0.9284722222222223 | 0 |
| 0.9291666666666667 | 0 |
| 0.9298611111111111 | 0 |
| 0.9305555555555555 | 0 |
| 0.93125 | 0 |
| 0.9319444444444445 | 0 |
| 0.9326388888888889 | 0 |
| 0.9333333333333332 | 0 |
| 0.9340277777777778 | 0 |
| 0.9347222222222222 | 0 |
| 0.9354166666666667 | 0 |
| 0.936111111111111 | 0 |
| 0.9368055555555556 | 0 |
| 0.9375 | 0 |
| 0.9381944444444444 | 0 |
| 0.938888888888889 | 0 |
| 0.9395833333333333 | 0 |
| 0.9402777777777778 | 0 |
| 0.9409722222222222 | 0 |
| 0.9416666666666668 | 0 |
| 0.9423611111111111 | 0 |
| 0.9430555555555555 | 0 |
| 0.94375 | 0 |
| 0.9444444444444445 | 0 |
| 0.9451388888888889 | 0 |
| 0.9458333333333333 | 0 |
| 0.9465277777777777 | 0 |
| 0.9472222222222223 | 0 |
| 0.9479166666666666 | 0 |
| 0.9486111111111111 | 0 |
| 0.9493055555555556 | 0 |
| 0.9500000000000001 | 0 |
| 0.9506944444444444 | 0 |
| 0.9513888888888888 | 0 |
| 0.9520833333333334 | 0 |
| 0.9527777777777778 | 0 |
| 0.9534722222222222 | 0 |
| 0.9541666666666666 | 0 |
| 0.9548611111111112 | 0 |
| 0.9555555555555556 | 0 |
| 0.9562499999999999 | 0 |
| 0.9569444444444444 | 0 |
| 0.9576388888888889 | 0 |
| 0.9583333333333334 | 0 |
| 0.9590277777777777 | 0 |
| 0.9597222222222223 | 0 |
| 0.9604166666666667 | 0 |
| 0.9611111111111111 | 0 |
| 0.9618055555555555 | 0 |
| 0.9625 | 0 |
| 0.9631944444444445 | 0 |
| 0.9638888888888889 | 0 |
| 0.9645833333333332 | 0 |
| 0.9652777777777778 | 0 |
| 0.9659722222222222 | 0 |
| 0.9666666666666667 | 0 |
| 0.967361111111111 | 0 |
| 0.9680555555555556 | 0 |
| 0.96875 | 0 |
| 0.9694444444444444 | 0 |
| 0.970138888888889 | 0 |
| 0.9708333333333333 | 0 |
| 0.9715277777777778 | 0 |
| 0.9722222222222222 | 0 |
| 0.9729166666666668 | 0 |
| 0.9736111111111111 | 0 |
| 0.9743055555555555 | 0 |
| 0.975 | 0 |
| 0.9756944444444445 | 0 |
| 0.9763888888888889 | 0 |
| 0.9770833333333333 | 0 |
| 0.9777777777777777 | 0 |
| 0.9784722222222223 | 0 |
| 0.9791666666666666 | 0 |
| 0.9798611111111111 | 0 |
| 0.9805555555555556 | 0 |
| 0.9812500000000001 | 0 |
| 0.9819444444444444 | 0 |
| 0.9826388888888888 | 0 |
| 0.9833333333333334 | 0 |
| 0.9840277777777778 | 0 |
| 0.9847222222222222 | 0 |
| 0.9854166666666666 | 0 |
| 0.9861111111111112 | 0 |
| 0.9868055555555556 | 0 |
| 0.9874999999999999 | 0 |
| 0.9881944444444444 | 0 |
| 0.9888888888888889 | 0 |
| 0.9895833333333334 | 0 |
| 0.9902777777777777 | 0 |
| 0.9909722222222223 | 0 |
| 0.9916666666666667 | 0 |
| 0.9923611111111111 | 0 |
| 0.9930555555555555 | 0 |
| 0.99375 | 0 |
| 0.9944444444444445 | 0 |
| 0.9951388888888889 | 0 |
| 0.9958333333333332 | 0 |
| 0.9965277777777778 | 0 |
| 0.9972222222222222 | 0 |
| 0.9979166666666667 | 0 |
| 0.998611111111111 | 0 |
| 0.9993055555555556 | 0 |